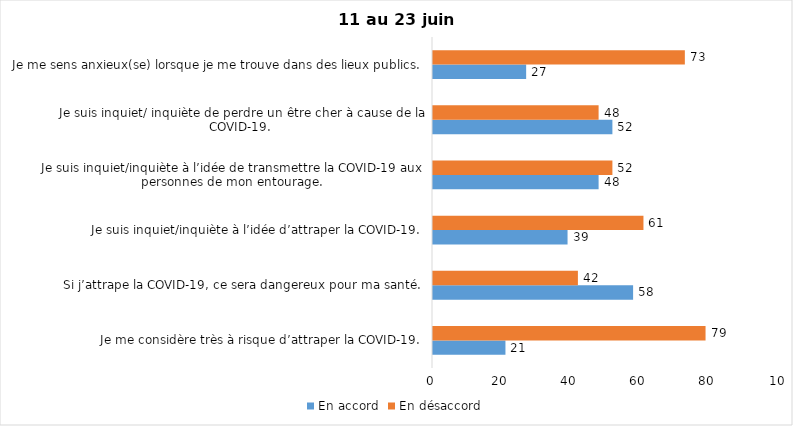
| Category | En accord | En désaccord |
|---|---|---|
| Je me considère très à risque d’attraper la COVID-19. | 21 | 79 |
| Si j’attrape la COVID-19, ce sera dangereux pour ma santé. | 58 | 42 |
| Je suis inquiet/inquiète à l’idée d’attraper la COVID-19. | 39 | 61 |
| Je suis inquiet/inquiète à l’idée de transmettre la COVID-19 aux personnes de mon entourage. | 48 | 52 |
| Je suis inquiet/ inquiète de perdre un être cher à cause de la COVID-19. | 52 | 48 |
| Je me sens anxieux(se) lorsque je me trouve dans des lieux publics. | 27 | 73 |